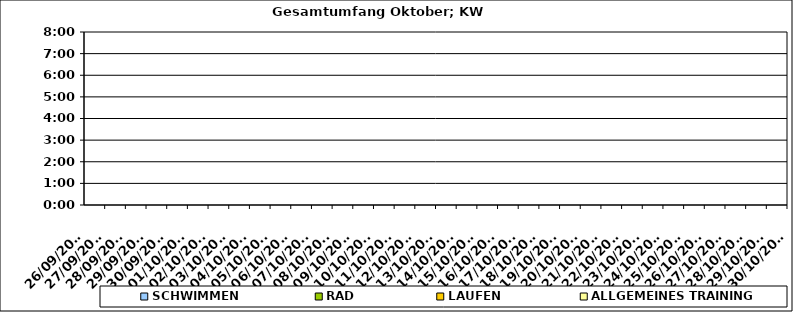
| Category | SCHWIMMEN | RAD | LAUFEN | ALLGEMEINES TRAINING |
|---|---|---|---|---|
| 26/09/2022 |  |  |  | 0 |
| 27/09/2022 |  |  |  | 0 |
| 28/09/2022 |  |  |  | 0 |
| 29/09/2022 |  |  |  | 0 |
| 30/09/2022 |  |  |  | 0 |
| 01/10/2022 |  |  |  | 0 |
| 02/10/2022 |  |  |  | 0 |
| 03/10/2022 |  |  |  | 0 |
| 04/10/2022 |  |  |  | 0 |
| 05/10/2022 |  |  |  | 0 |
| 06/10/2022 |  |  |  | 0 |
| 07/10/2022 |  |  |  | 0 |
| 08/10/2022 |  |  |  | 0 |
| 09/10/2022 |  |  |  | 0 |
| 10/10/2022 |  |  |  | 0 |
| 11/10/2022 |  |  |  | 0 |
| 12/10/2022 |  |  |  | 0 |
| 13/10/2022 |  |  |  | 0 |
| 14/10/2022 |  |  |  | 0 |
| 15/10/2022 |  |  |  | 0 |
| 16/10/2022 |  |  |  | 0 |
| 17/10/2022 |  |  |  | 0 |
| 18/10/2022 |  |  |  | 0 |
| 19/10/2022 |  |  |  | 0 |
| 20/10/2022 |  |  |  | 0 |
| 21/10/2022 |  |  |  | 0 |
| 22/10/2022 |  |  |  | 0 |
| 23/10/2022 |  |  |  | 0 |
| 24/10/2022 |  |  |  | 0 |
| 25/10/2022 |  |  |  | 0 |
| 26/10/2022 |  |  |  | 0 |
| 27/10/2022 |  |  |  | 0 |
| 28/10/2022 |  |  |  | 0 |
| 29/10/2022 |  |  |  | 0 |
| 30/10/2022 |  |  |  | 0 |